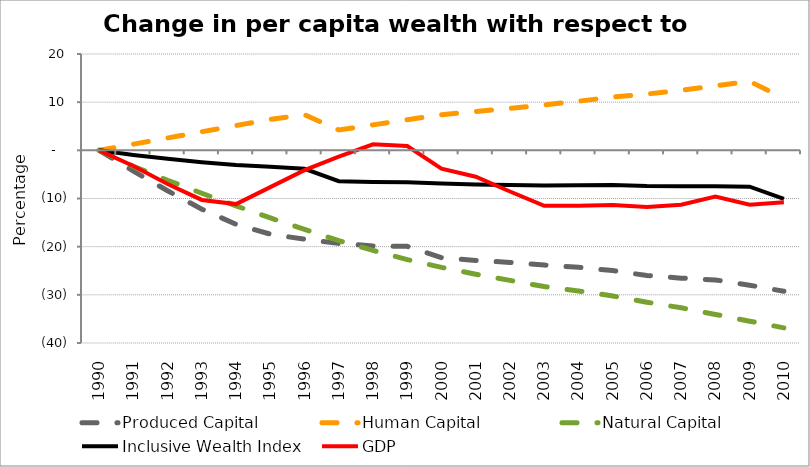
| Category | Produced Capital  | Human Capital | Natural Capital | Inclusive Wealth Index | GDP |
|---|---|---|---|---|---|
| 1990.0 | 0 | 0 | 0 | 0 | 0 |
| 1991.0 | -4.305 | 1.285 | -3.294 | -0.956 | -3.252 |
| 1992.0 | -8.394 | 2.573 | -6.213 | -1.758 | -6.987 |
| 1993.0 | -12.215 | 3.863 | -8.912 | -2.453 | -10.296 |
| 1994.0 | -15.345 | 5.154 | -11.532 | -3.028 | -11.161 |
| 1995.0 | -17.401 | 6.439 | -14.024 | -3.42 | -7.638 |
| 1996.0 | -18.46 | 7.391 | -16.429 | -3.828 | -4.105 |
| 1997.0 | -19.332 | 4.222 | -18.742 | -6.409 | -1.287 |
| 1998.0 | -19.851 | 5.288 | -20.784 | -6.566 | 1.25 |
| 1999.0 | -19.924 | 6.354 | -22.685 | -6.616 | 0.902 |
| 2000.0 | -22.277 | 7.404 | -24.299 | -6.89 | -3.796 |
| 2001.0 | -22.866 | 8.046 | -25.726 | -7.086 | -5.474 |
| 2002.0 | -23.263 | 8.715 | -27.005 | -7.193 | -8.545 |
| 2003.0 | -23.81 | 9.428 | -28.282 | -7.295 | -11.515 |
| 2004.0 | -24.275 | 10.207 | -29.189 | -7.232 | -11.5 |
| 2005.0 | -24.968 | 11.045 | -30.225 | -7.208 | -11.353 |
| 2006.0 | -25.98 | 11.686 | -31.535 | -7.424 | -11.782 |
| 2007.0 | -26.535 | 12.486 | -32.696 | -7.443 | -11.306 |
| 2008.0 | -26.901 | 13.39 | -34.071 | -7.45 | -9.585 |
| 2009.0 | -28.001 | 14.325 | -35.471 | -7.547 | -11.281 |
| 2010.0 | -29.266 | 10.801 | -36.861 | -10.074 | -10.791 |